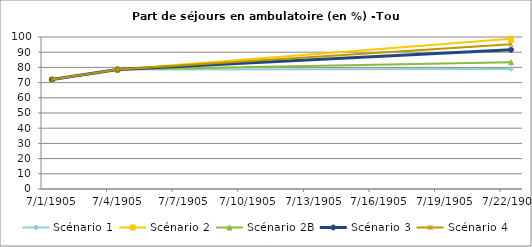
| Category | Scénario 1 | Scénario 2 | Scénario 2B | Scénario 3 | Scénario 4 |
|---|---|---|---|---|---|
| 2009.0 | 72.055 | 72.055 | 72.055 | 72.055 | 72.055 |
| 2012.0 | 78.566 | 78.566 | 78.566 | 78.566 | 78.566 |
| 2030.0 | 79.004 | 98.867 | 83.344 | 91.61 | 95.287 |